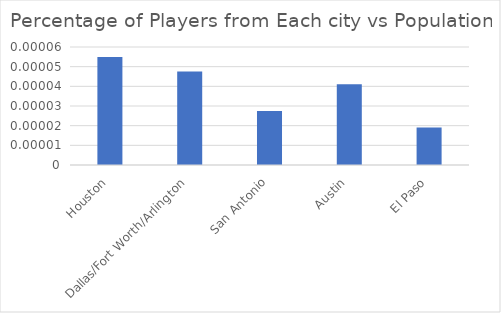
| Category | Series 0 |
|---|---|
| Houston | 0 |
| Dallas/Fort Worth/Arlington | 0 |
| San Antonio | 0 |
| Austin | 0 |
| El Paso | 0 |